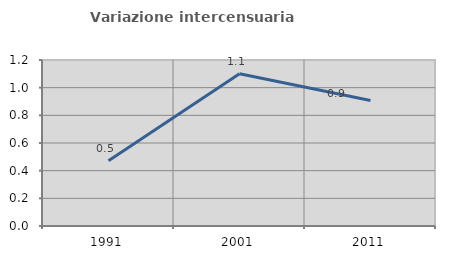
| Category | Variazione intercensuaria annua |
|---|---|
| 1991.0 | 0.471 |
| 2001.0 | 1.101 |
| 2011.0 | 0.907 |